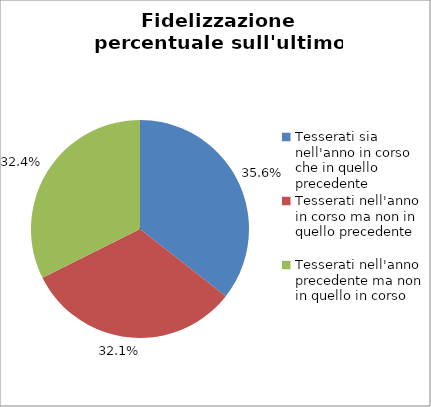
| Category | Nr. Tesserati |
|---|---|
| Tesserati sia nell'anno in corso che in quello precedente | 232 |
| Tesserati nell'anno in corso ma non in quello precedente | 209 |
| Tesserati nell'anno precedente ma non in quello in corso | 211 |